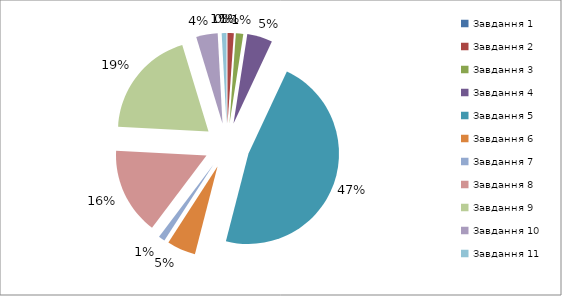
| Category | Series 0 |
|---|---|
| Завдання 1  | 0 |
| Завдання 2 | 789330 |
| Завдання 3 | 931375.4 |
| Завдання 4 | 3186525 |
| Завдання 5 | 33143170 |
| Завдання 6 | 3601931 |
| Завдання 7 | 810000 |
| Завдання 8 | 10970077 |
| Завдання 9 | 13708081 |
| Завдання 10 | 2700000 |
| Завдання 11 | 600000 |